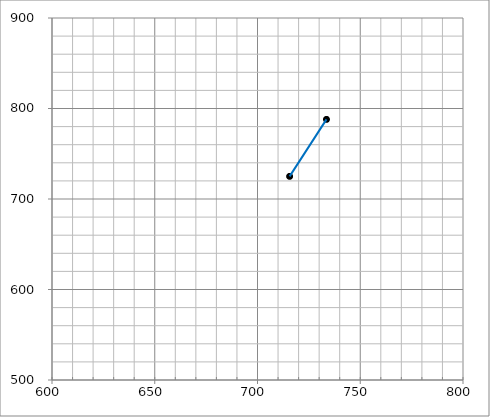
| Category | Series 0 |
|---|---|
| 733.5659898477157 | 788 |
| 715.6275862068965 | 725 |